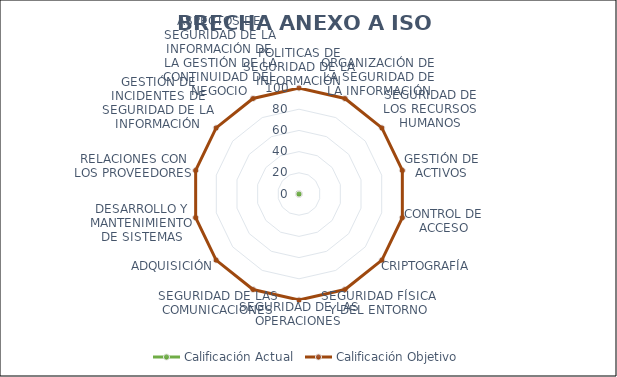
| Category | Calificación Actual | Calificación Objetivo |
|---|---|---|
| 0 | 0 | 100 |
| 1 | 0 | 100 |
| 2 | 0 | 100 |
| 3 | 0 | 100 |
| 4 | 0 | 100 |
| 5 | 0 | 100 |
| 6 | 0 | 100 |
| 7 | 0 | 100 |
| 8 | 0 | 100 |
| 9 | 0 | 100 |
| 10 | 0 | 100 |
| 11 | 0 | 100 |
| 12 | 0 | 100 |
| 13 | 0 | 100 |